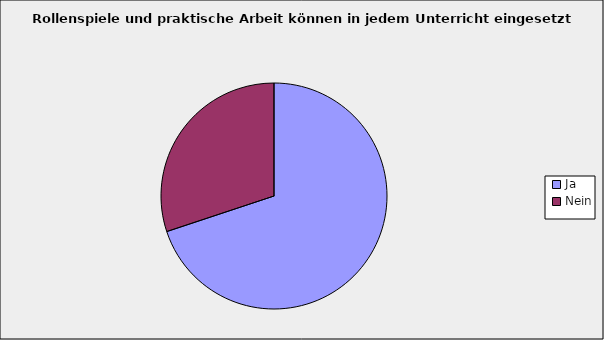
| Category | Series 0 |
|---|---|
| Ja | 0.699 |
| Nein | 0.301 |